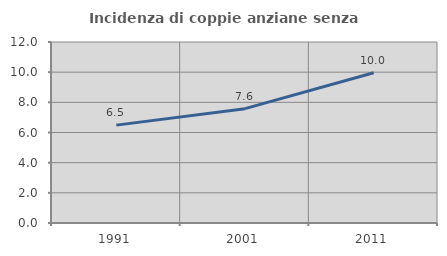
| Category | Incidenza di coppie anziane senza figli  |
|---|---|
| 1991.0 | 6.489 |
| 2001.0 | 7.58 |
| 2011.0 | 9.964 |